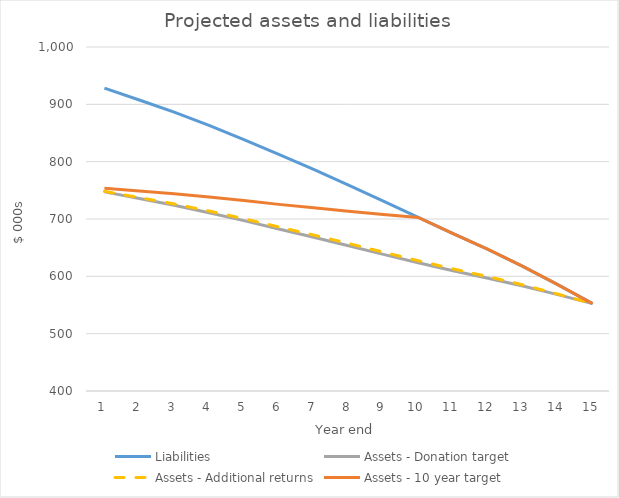
| Category | Liabilities | Assets - Donation target | Assets - Additional returns | Assets - 10 year target |
|---|---|---|---|---|
| 0 | 928.321 | 747.305 | 748.196 | 753.694 |
| 1 | 907.637 | 735.68 | 737.357 | 748.767 |
| 2 | 886.446 | 723.944 | 726.304 | 744.054 |
| 3 | 863.385 | 711.028 | 713.964 | 738.469 |
| 4 | 838.637 | 697.108 | 700.502 | 732.189 |
| 5 | 812.599 | 682.439 | 686.163 | 725.51 |
| 6 | 786.41 | 668.113 | 672.034 | 719.567 |
| 7 | 759.182 | 653.317 | 657.296 | 713.562 |
| 8 | 731.089 | 638.271 | 642.163 | 707.732 |
| 9 | 702.741 | 623.581 | 627.233 | 702.741 |
| 10 | 674.62 | 609.7 | 612.958 | 674.62 |
| 11 | 646.835 | 596.797 | 599.502 | 646.835 |
| 12 | 617.46 | 583.182 | 585.167 | 617.46 |
| 13 | 585.634 | 568.053 | 569.14 | 585.634 |
| 14 | 552.439 | 552.439 | 552.439 | 552.439 |